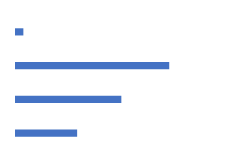
| Category | Series 0 |
|---|---|
| Chemical | 83 |
| Food | 143 |
| Bevarage | 208 |
| Other | 10 |